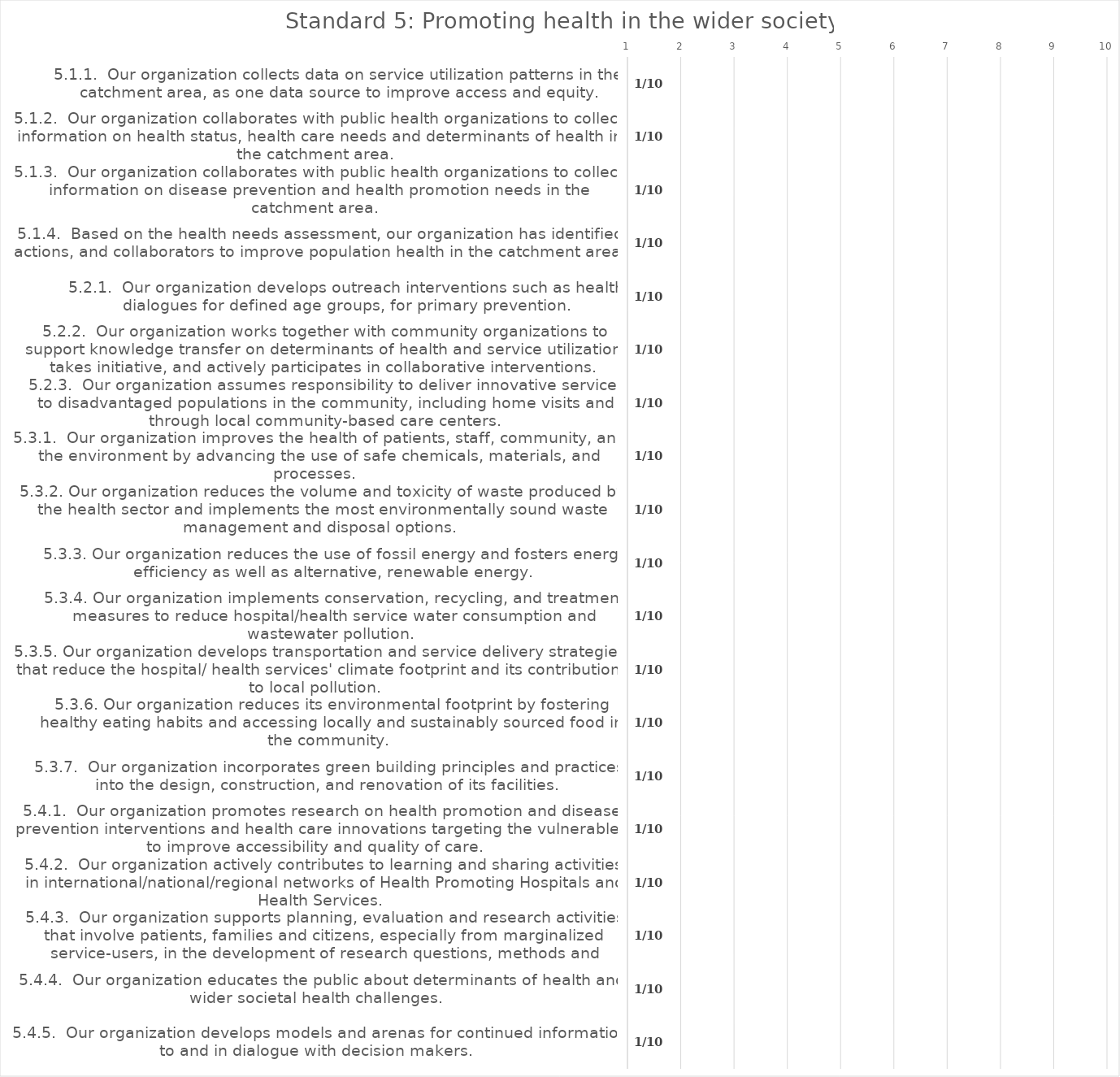
| Category | value |
|---|---|
| 5.1.1.  Our organization collects data on service utilization patterns in the catchment area, as one data source to improve access and equity. | 1 |
| 5.1.2.  Our organization collaborates with public health organizations to collect information on health status, health care needs and determinants of health in the catchment area. | 1 |
| 5.1.3.  Our organization collaborates with public health organizations to collect information on disease prevention and health promotion needs in the catchment area. | 1 |
| 5.1.4.  Based on the health needs assessment, our organization has identified actions, and collaborators to improve population health in the catchment area. | 1 |
| 5.2.1.  Our organization develops outreach interventions such as health dialogues for defined age groups, for primary prevention. | 1 |
| 5.2.2.  Our organization works together with community organizations to support knowledge transfer on determinants of health and service utilization, takes initiative, and actively participates in collaborative interventions. | 1 |
| 5.2.3.  Our organization assumes responsibility to deliver innovative services to disadvantaged populations in the community, including home visits and through local community-based care centers. | 1 |
| 5.3.1.  Our organization improves the health of patients, staff, community, and the environment by advancing the use of safe chemicals, materials, and processes. | 1 |
| 5.3.2. Our organization reduces the volume and toxicity of waste produced by the health sector and implements the most environmentally sound waste management and disposal options. | 1 |
| 5.3.3. Our organization reduces the use of fossil energy and fosters energy efficiency as well as alternative, renewable energy. | 1 |
| 5.3.4. Our organization implements conservation, recycling, and treatment measures to reduce hospital/health service water consumption and wastewater pollution. | 1 |
| 5.3.5. Our organization develops transportation and service delivery strategies that reduce the hospital/ health services' climate footprint and its contribution to local pollution. | 1 |
| 5.3.6. Our organization reduces its environmental footprint by fostering healthy eating habits and accessing locally and sustainably sourced food in the community. | 1 |
| 5.3.7.  Our organization incorporates green building principles and practices into the design, construction, and renovation of its facilities. | 1 |
| 5.4.1.  Our organization promotes research on health promotion and disease prevention interventions and health care innovations targeting the vulnerable, to improve accessibility and quality of care.  | 1 |
| 5.4.2.  Our organization actively contributes to learning and sharing activities in international/national/regional networks of Health Promoting Hospitals and Health Services. | 1 |
| 5.4.3.  Our organization supports planning, evaluation and research activities that involve patients, families and citizens, especially from marginalized service-users, in the development of research questions, methods and reporting of healthcare research  | 1 |
| 5.4.4.  Our organization educates the public about determinants of health and wider societal health challenges.  | 1 |
| 5.4.5.  Our organization develops models and arenas for continued information to and in dialogue with decision makers. | 1 |